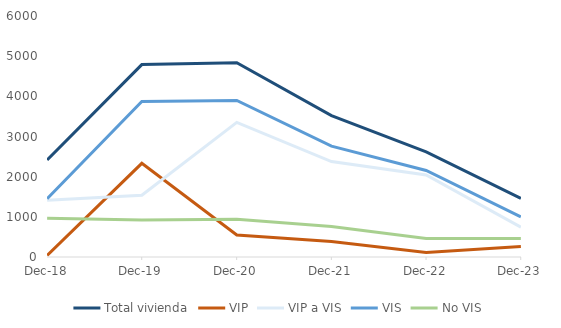
| Category | Total vivienda | VIP | VIP a VIS | VIS | No VIS |
|---|---|---|---|---|---|
| 2018-12-01 | 2418 | 39 | 1413 | 1452 | 966 |
| 2019-12-01 | 4790 | 2332 | 1538 | 3870 | 920 |
| 2020-12-01 | 4836 | 548 | 3351 | 3899 | 937 |
| 2021-12-01 | 3520 | 384 | 2376 | 2760 | 760 |
| 2022-12-01 | 2617 | 113 | 2041 | 2154 | 463 |
| 2023-12-01 | 1459 | 259 | 742 | 1001 | 458 |